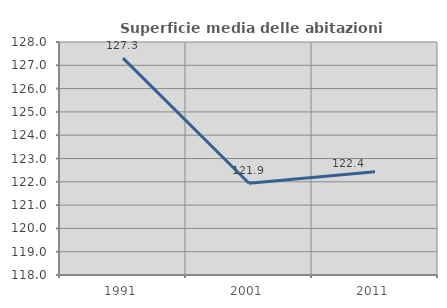
| Category | Superficie media delle abitazioni occupate |
|---|---|
| 1991.0 | 127.305 |
| 2001.0 | 121.935 |
| 2011.0 | 122.435 |